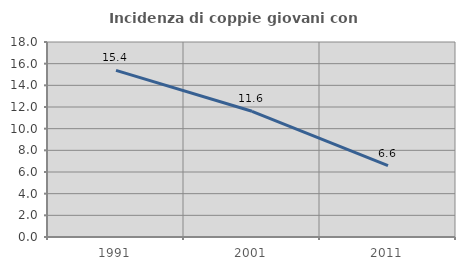
| Category | Incidenza di coppie giovani con figli |
|---|---|
| 1991.0 | 15.38 |
| 2001.0 | 11.604 |
| 2011.0 | 6.597 |